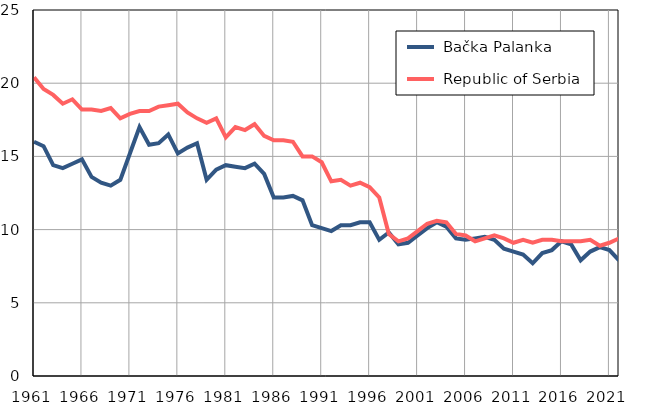
| Category |  Bačka Palanka |  Republic of Serbia |
|---|---|---|
| 1961.0 | 16 | 20.4 |
| 1962.0 | 15.7 | 19.6 |
| 1963.0 | 14.4 | 19.2 |
| 1964.0 | 14.2 | 18.6 |
| 1965.0 | 14.5 | 18.9 |
| 1966.0 | 14.8 | 18.2 |
| 1967.0 | 13.6 | 18.2 |
| 1968.0 | 13.2 | 18.1 |
| 1969.0 | 13 | 18.3 |
| 1970.0 | 13.4 | 17.6 |
| 1971.0 | 15.2 | 17.9 |
| 1972.0 | 17 | 18.1 |
| 1973.0 | 15.8 | 18.1 |
| 1974.0 | 15.9 | 18.4 |
| 1975.0 | 16.5 | 18.5 |
| 1976.0 | 15.2 | 18.6 |
| 1977.0 | 15.6 | 18 |
| 1978.0 | 15.9 | 17.6 |
| 1979.0 | 13.4 | 17.3 |
| 1980.0 | 14.1 | 17.6 |
| 1981.0 | 14.4 | 16.3 |
| 1982.0 | 14.3 | 17 |
| 1983.0 | 14.2 | 16.8 |
| 1984.0 | 14.5 | 17.2 |
| 1985.0 | 13.8 | 16.4 |
| 1986.0 | 12.2 | 16.1 |
| 1987.0 | 12.2 | 16.1 |
| 1988.0 | 12.3 | 16 |
| 1989.0 | 12 | 15 |
| 1990.0 | 10.3 | 15 |
| 1991.0 | 10.1 | 14.6 |
| 1992.0 | 9.9 | 13.3 |
| 1993.0 | 10.3 | 13.4 |
| 1994.0 | 10.3 | 13 |
| 1995.0 | 10.5 | 13.2 |
| 1996.0 | 10.5 | 12.9 |
| 1997.0 | 9.3 | 12.2 |
| 1998.0 | 9.8 | 9.7 |
| 1999.0 | 9 | 9.2 |
| 2000.0 | 9.1 | 9.4 |
| 2001.0 | 9.6 | 9.9 |
| 2002.0 | 10.1 | 10.4 |
| 2003.0 | 10.5 | 10.6 |
| 2004.0 | 10.2 | 10.5 |
| 2005.0 | 9.4 | 9.7 |
| 2006.0 | 9.3 | 9.6 |
| 2007.0 | 9.4 | 9.2 |
| 2008.0 | 9.5 | 9.4 |
| 2009.0 | 9.3 | 9.6 |
| 2010.0 | 8.7 | 9.4 |
| 2011.0 | 8.5 | 9.1 |
| 2012.0 | 8.3 | 9.3 |
| 2013.0 | 7.7 | 9.1 |
| 2014.0 | 8.4 | 9.3 |
| 2015.0 | 8.6 | 9.3 |
| 2016.0 | 9.2 | 9.2 |
| 2017.0 | 9 | 9.2 |
| 2018.0 | 7.9 | 9.2 |
| 2019.0 | 8.5 | 9.3 |
| 2020.0 | 8.8 | 8.9 |
| 2021.0 | 8.6 | 9.1 |
| 2022.0 | 7.9 | 9.4 |